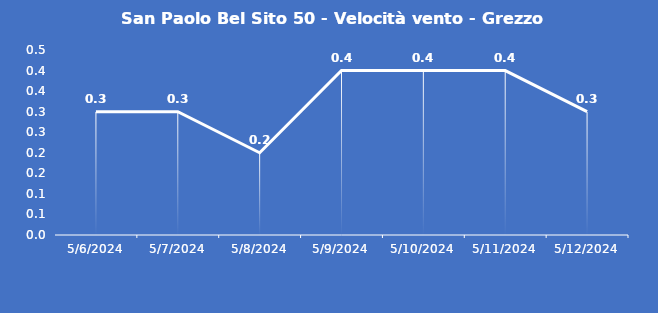
| Category | San Paolo Bel Sito 50 - Velocità vento - Grezzo (m/s) |
|---|---|
| 5/6/24 | 0.3 |
| 5/7/24 | 0.3 |
| 5/8/24 | 0.2 |
| 5/9/24 | 0.4 |
| 5/10/24 | 0.4 |
| 5/11/24 | 0.4 |
| 5/12/24 | 0.3 |